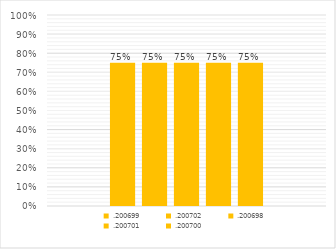
| Category | .200699 | .200702 | .200698 | .200701 | .200700 |
|---|---|---|---|---|---|
| 0 | 0.75 | 0.75 | 0.75 | 0.75 | 0.75 |